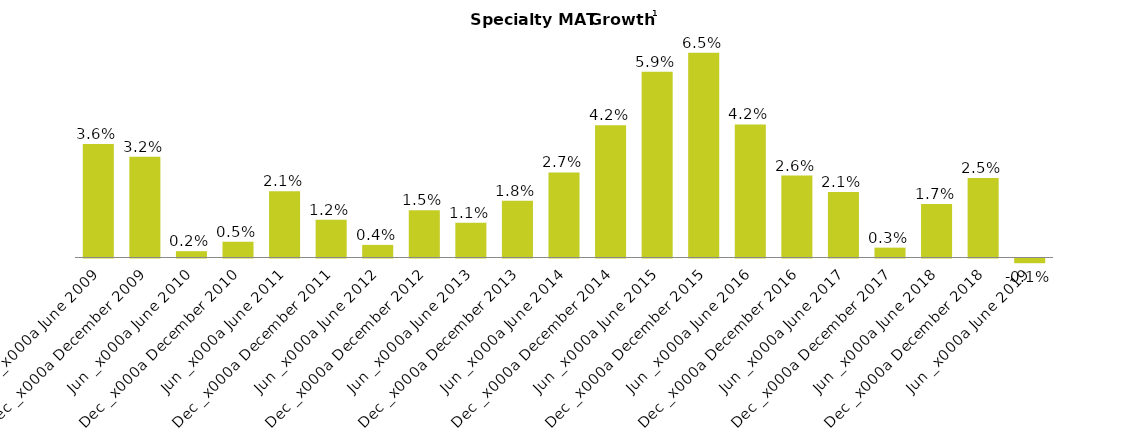
| Category | Specialty MAT |
|---|---|
| 2009-06-30 | 0.036 |
| 2009-12-31 | 0.032 |
| 2010-06-30 | 0.002 |
| 2010-12-31 | 0.005 |
| 2011-06-30 | 0.021 |
| 2011-12-31 | 0.012 |
| 2012-06-30 | 0.004 |
| 2012-12-01 | 0.015 |
| 2013-06-30 | 0.011 |
| 2013-12-31 | 0.018 |
| 2014-06-01 | 0.027 |
| 2014-12-01 | 0.042 |
| 2015-06-30 | 0.059 |
| 2015-12-01 | 0.065 |
| 2016-06-30 | 0.042 |
| 2016-12-31 | 0.026 |
| 2017-06-30 | 0.021 |
| 2017-12-01 | 0.003 |
| 2018-06-30 | 0.017 |
| 2018-12-01 | 0.025 |
| 2019-06-30 | -0.001 |